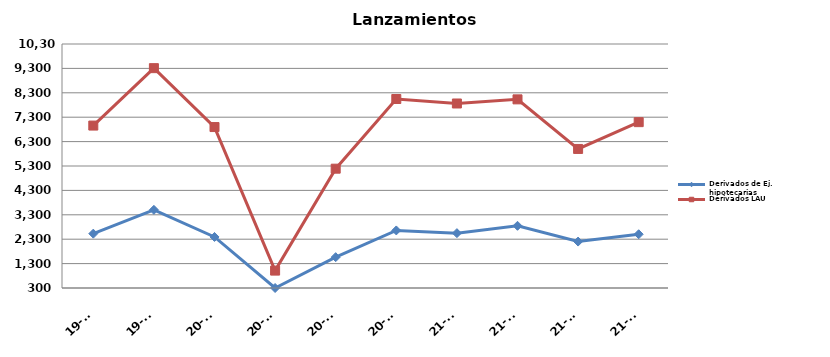
| Category | Derivados de Ej. hipotecarias | Derivados LAU |
|---|---|---|
| 19-T3 | 2527 | 6957 |
| 19-T4 | 3503 | 9310 |
| 20-T1 | 2392 | 6896 |
| 20-T2 | 300 | 1013 |
| 20-T3 | 1564 | 5190 |
| 20-T4 | 2659 | 8046 |
| 21-T1 | 2548 | 7862 |
| 21-T2 | 2849 | 8031 |
| 21-T3 | 2203 | 5999 |
| 21-T4 | 2503 | 7097 |